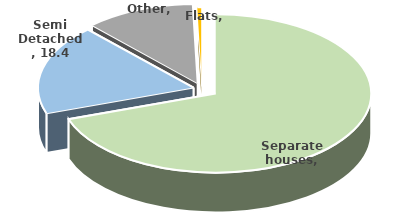
| Category | Series 0 |
|---|---|
| Separate houses | 69.748 |
| Semi Detached | 18.361 |
| Flats | 11.397 |
| Other | 0.502 |